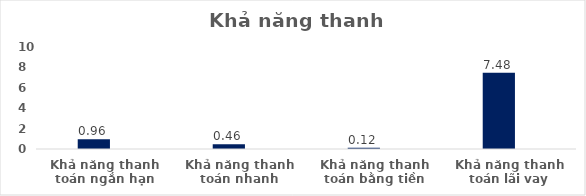
| Category | Series 0 | Series 1 | Series 2 | Series 3 | Series 4 | Series 5 |
|---|---|---|---|---|---|---|
| Khả năng thanh toán ngắn hạn | 0 | 0.956 |  |  |  |  |
| Khả năng thanh toán nhanh | 0 | 0.459 |  |  |  |  |
| Khả năng thanh toán bằng tiền | 0 | 0.116 |  |  |  |  |
| Khả năng thanh toán lãi vay | 0 | 7.478 |  |  |  |  |